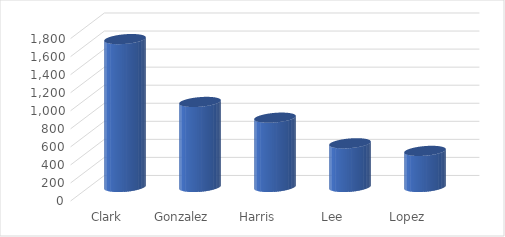
| Category | Total |
|---|---|
| Clark | 1638.83 |
| Gonzalez | 942.55 |
| Harris | 768.17 |
| Lee | 484.33 |
| Lopez | 400.08 |